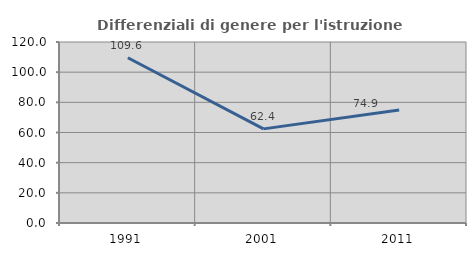
| Category | Differenziali di genere per l'istruzione superiore |
|---|---|
| 1991.0 | 109.563 |
| 2001.0 | 62.395 |
| 2011.0 | 74.899 |